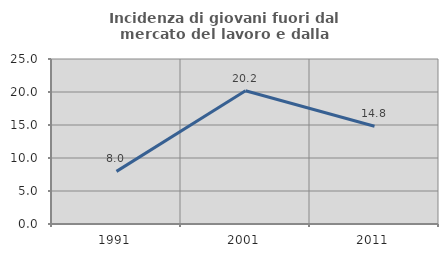
| Category | Incidenza di giovani fuori dal mercato del lavoro e dalla formazione  |
|---|---|
| 1991.0 | 7.975 |
| 2001.0 | 20.182 |
| 2011.0 | 14.808 |